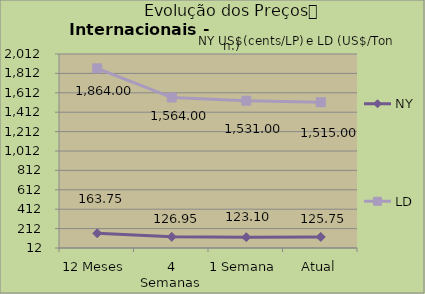
| Category | NY | LD |
|---|---|---|
| 12 Meses | 163.75 | 1864 |
| 4 Semanas | 126.95 | 1564 |
| 1 Semana | 123.1 | 1531 |
| Atual | 125.75 | 1515 |